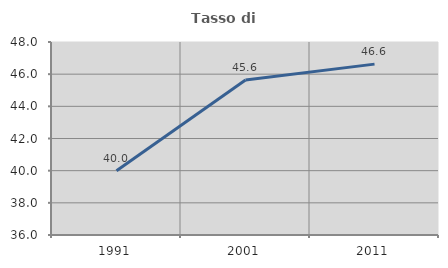
| Category | Tasso di occupazione   |
|---|---|
| 1991.0 | 40 |
| 2001.0 | 45.631 |
| 2011.0 | 46.625 |